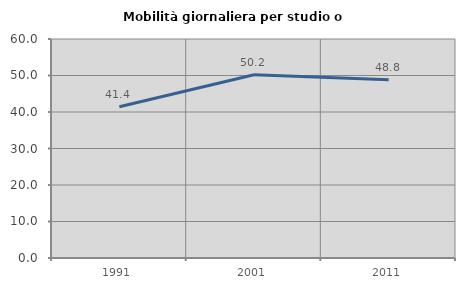
| Category | Mobilità giornaliera per studio o lavoro |
|---|---|
| 1991.0 | 41.419 |
| 2001.0 | 50.207 |
| 2011.0 | 48.814 |